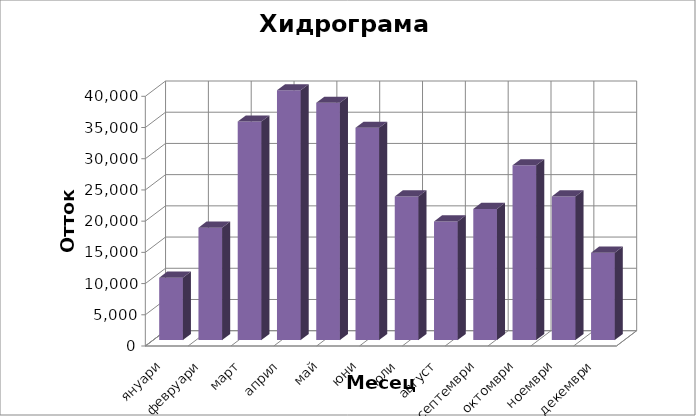
| Category | януари |
|---|---|
| януари | 10000 |
| февруари | 18000 |
| март | 35000 |
| април | 40000 |
| май | 38000 |
| юни | 34000 |
| юли | 23000 |
| август | 19000 |
| септември | 21000 |
| октомври | 28000 |
| ноември | 23000 |
| декември | 14000 |